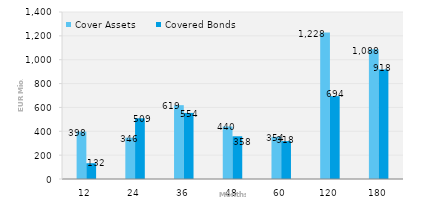
| Category | Cover Assets | Covered Bonds |
|---|---|---|
| 12.0 | 397.509 | 132.214 |
| 24.0 | 346.192 | 509 |
| 36.0 | 618.927 | 554 |
| 48.0 | 440.417 | 358.09 |
| 60.0 | 353.641 | 317.726 |
| 120.0 | 1227.56 | 694.324 |
| 180.0 | 1088.356 | 917.787 |